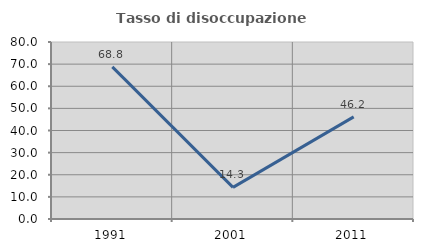
| Category | Tasso di disoccupazione giovanile  |
|---|---|
| 1991.0 | 68.75 |
| 2001.0 | 14.286 |
| 2011.0 | 46.154 |